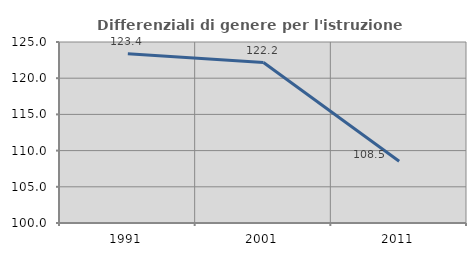
| Category | Differenziali di genere per l'istruzione superiore |
|---|---|
| 1991.0 | 123.379 |
| 2001.0 | 122.162 |
| 2011.0 | 108.52 |